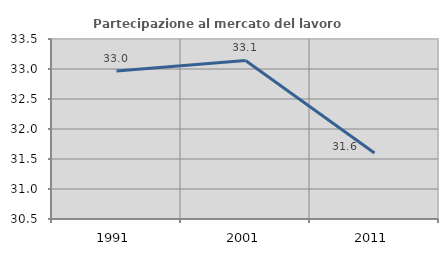
| Category | Partecipazione al mercato del lavoro  femminile |
|---|---|
| 1991.0 | 32.969 |
| 2001.0 | 33.142 |
| 2011.0 | 31.599 |